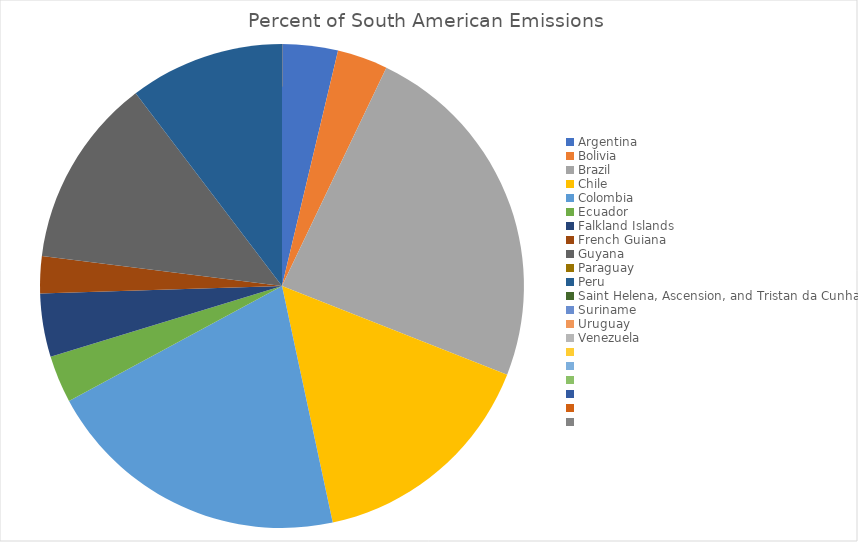
| Category | Percent of South American Emissions  |
|---|---|
| Argentina | 0.037 |
| Bolivia | 0.034 |
| Brazil | 0.239 |
| Chile | 0.157 |
| Colombia | 0.205 |
| Ecuador | 0.032 |
| Falkland Islands | 0.042 |
| French Guiana | 0.025 |
| Guyana | 0.127 |
| Paraguay | 0 |
| Peru | 0.103 |
| Saint Helena, Ascension, and Tristan da Cunha | 0 |
| Suriname | 0 |
| Uruguay | 0 |
| Venezuela | 0 |